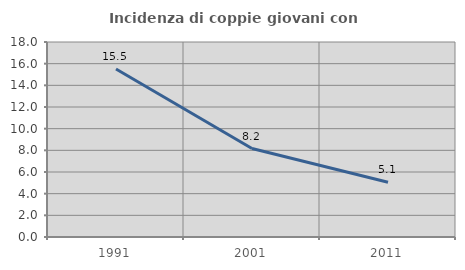
| Category | Incidenza di coppie giovani con figli |
|---|---|
| 1991.0 | 15.51 |
| 2001.0 | 8.163 |
| 2011.0 | 5.059 |